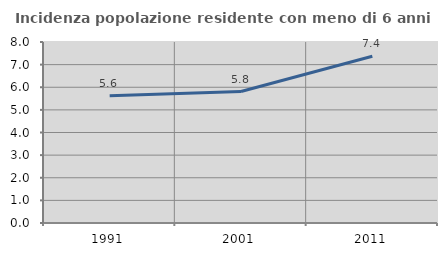
| Category | Incidenza popolazione residente con meno di 6 anni |
|---|---|
| 1991.0 | 5.627 |
| 2001.0 | 5.81 |
| 2011.0 | 7.372 |